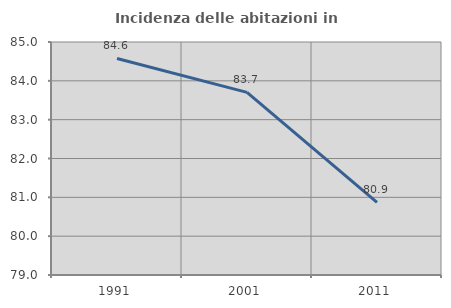
| Category | Incidenza delle abitazioni in proprietà  |
|---|---|
| 1991.0 | 84.576 |
| 2001.0 | 83.704 |
| 2011.0 | 80.871 |